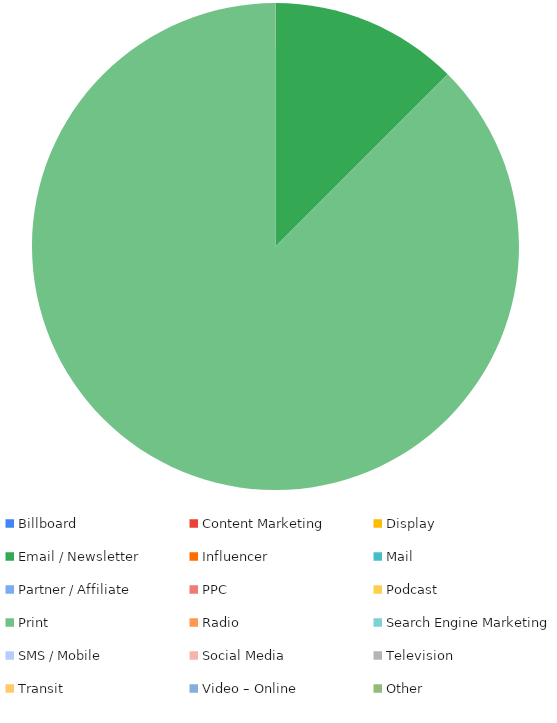
| Category | Series 0 |
|---|---|
| Billboard | 0 |
| Content Marketing | 0 |
| Display | 0 |
| Email / Newsletter | 50 |
| Influencer | 0 |
| Mail | 0 |
| Partner / Affiliate | 0 |
| PPC | 0 |
| Podcast | 0 |
| Print | 350 |
| Radio | 0 |
| Search Engine Marketing | 0 |
| SMS / Mobile | 0 |
| Social Media | 0 |
| Television | 0 |
| Transit | 0 |
| Video – Online | 0 |
| Other | 0 |